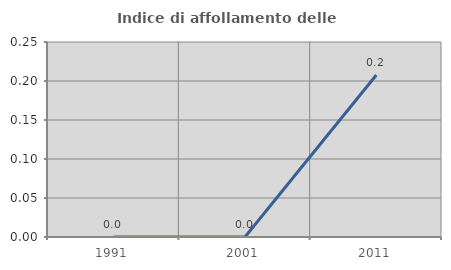
| Category | Indice di affollamento delle abitazioni  |
|---|---|
| 1991.0 | 0 |
| 2001.0 | 0 |
| 2011.0 | 0.208 |